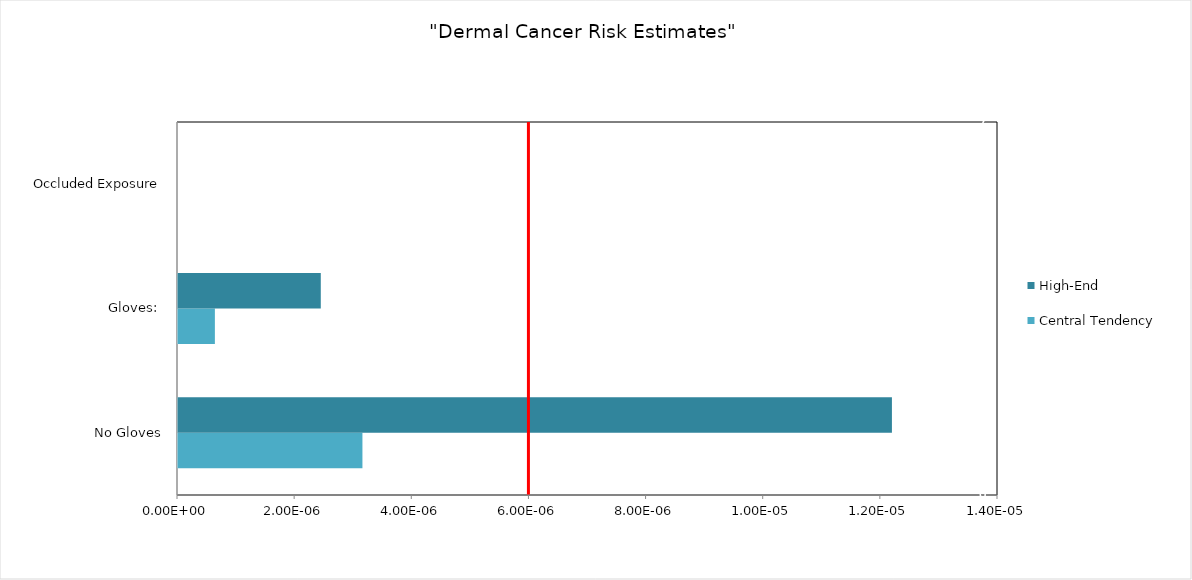
| Category | Central Tendency | High-End |
|---|---|---|
| No Gloves | 0 | 0 |
| Gloves:  | 0 | 0 |
| Occluded Exposure | 0 | 0 |